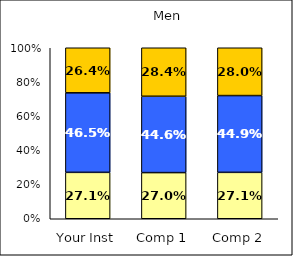
| Category | Low Academic Disengagement | Average Academic Disengagement | High Academic Disengagement |
|---|---|---|---|
| Your Inst | 0.271 | 0.465 | 0.264 |
| Comp 1 | 0.27 | 0.446 | 0.284 |
| Comp 2 | 0.271 | 0.449 | 0.28 |